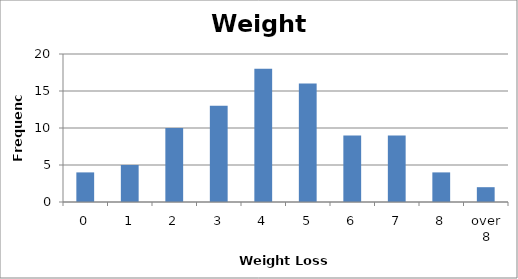
| Category | Freq |
|---|---|
| 0 | 4 |
| 1 | 5 |
| 2 | 10 |
| 3 | 13 |
| 4 | 18 |
| 5 | 16 |
| 6 | 9 |
| 7 | 9 |
| 8 | 4 |
| over 8 | 2 |